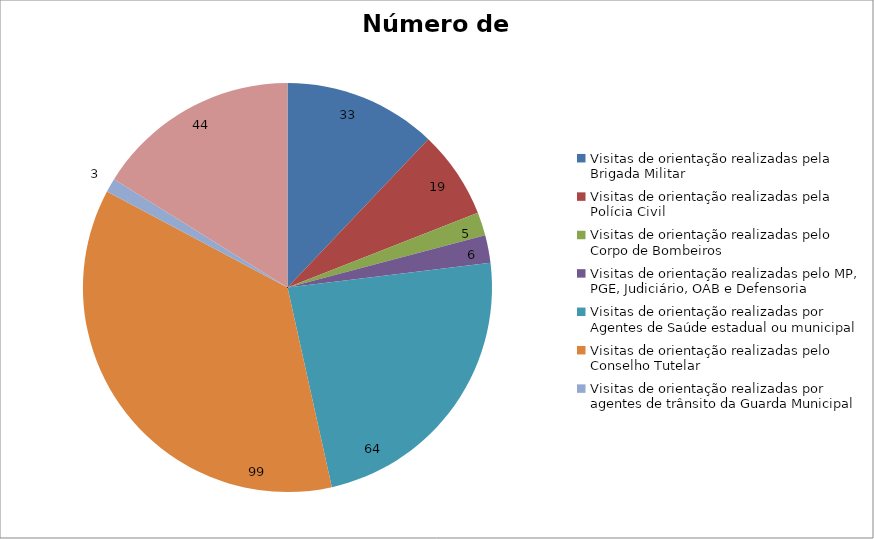
| Category | Número de Ações |
|---|---|
| Visitas de orientação realizadas pela Brigada Militar | 33 |
| Visitas de orientação realizadas pela Polícia Civil | 19 |
| Visitas de orientação realizadas pelo Corpo de Bombeiros | 5 |
| Visitas de orientação realizadas pelo MP, PGE, Judiciário, OAB e Defensoria | 6 |
| Visitas de orientação realizadas por Agentes de Saúde estadual ou municipal | 64 |
| Visitas de orientação realizadas pelo Conselho Tutelar | 99 |
| Visitas de orientação realizadas por agentes de trânsito da Guarda Municipal | 3 |
| Visitas de orientação realizadas por ONGs, entidades privadas, CRAS e CREAS | 44 |